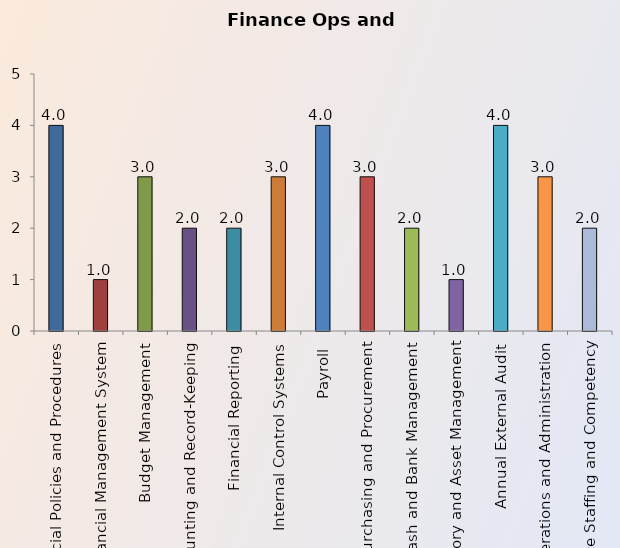
| Category | Series 0 |
|---|---|
| Financial Policies and Procedures | 4 |
| Financial Management System | 1 |
| Budget Management | 3 |
| Accounting and Record-Keeping | 2 |
| Financial Reporting | 2 |
| Internal Control Systems | 3 |
| Payroll | 4 |
| Purchasing and Procurement | 3 |
| Cash and Bank Management | 2 |
| Inventory and Asset Management | 1 |
| Annual External Audit | 4 |
| Operations and Administration | 3 |
| Finance Staffing and Competency | 2 |